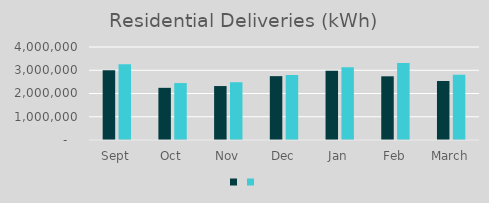
| Category | Series 1 | Series 0 |
|---|---|---|
| Sept | 2997393 | 3255766 |
| Oct | 2243531 | 2448610 |
| Nov | 2320465 | 2484917 |
| Dec | 2746090 | 2793607 |
| Jan | 2975165 | 3124442 |
| Feb | 2739688 | 3307618 |
| March | 2538769 | 2805250 |